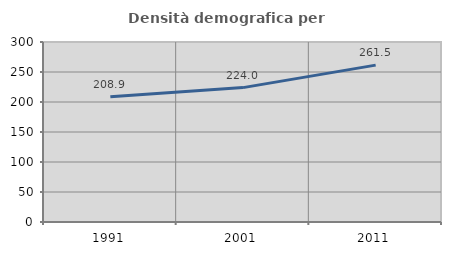
| Category | Densità demografica |
|---|---|
| 1991.0 | 208.862 |
| 2001.0 | 223.976 |
| 2011.0 | 261.453 |